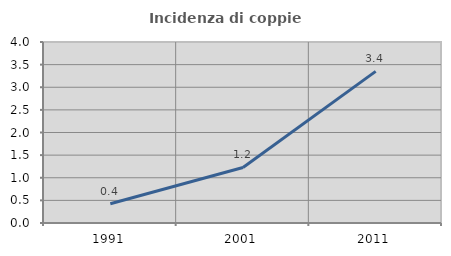
| Category | Incidenza di coppie miste |
|---|---|
| 1991.0 | 0.426 |
| 2001.0 | 1.227 |
| 2011.0 | 3.35 |